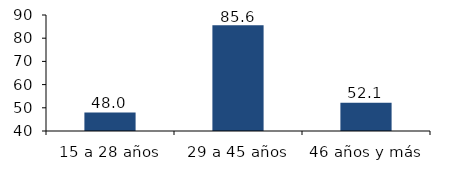
| Category | Series 0 |
|---|---|
| 15 a 28 años | 47.955 |
| 29 a 45 años | 85.56 |
| 46 años y más | 52.144 |